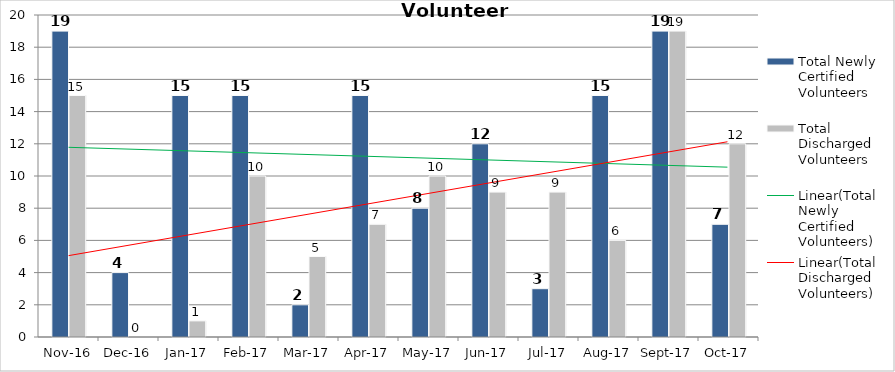
| Category | Total Newly Certified Volunteers | Total Discharged Volunteers |
|---|---|---|
| 2016-11-01 | 19 | 15 |
| 2016-12-01 | 4 | 0 |
| 2017-01-01 | 15 | 1 |
| 2017-02-01 | 15 | 10 |
| 2017-03-01 | 2 | 5 |
| 2017-04-01 | 15 | 7 |
| 2017-05-01 | 8 | 10 |
| 2017-06-01 | 12 | 9 |
| 2017-07-01 | 3 | 9 |
| 2017-08-01 | 15 | 6 |
| 2017-09-01 | 19 | 19 |
| 2017-10-01 | 7 | 12 |